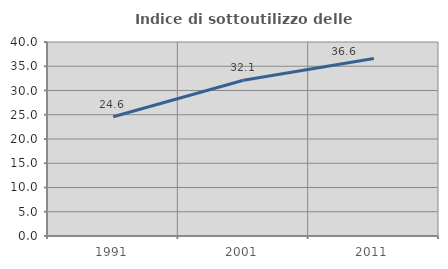
| Category | Indice di sottoutilizzo delle abitazioni  |
|---|---|
| 1991.0 | 24.6 |
| 2001.0 | 32.103 |
| 2011.0 | 36.609 |